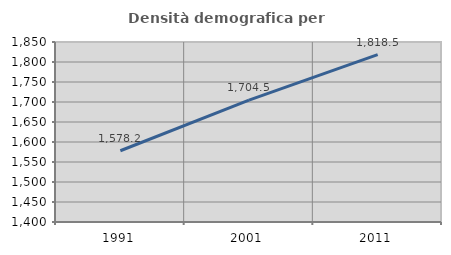
| Category | Densità demografica |
|---|---|
| 1991.0 | 1578.154 |
| 2001.0 | 1704.48 |
| 2011.0 | 1818.538 |